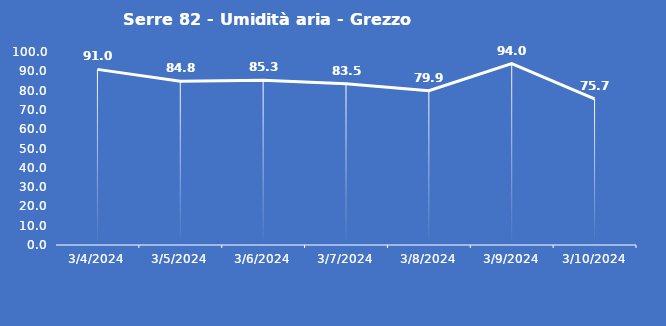
| Category | Serre 82 - Umidità aria - Grezzo (%) |
|---|---|
| 3/4/24 | 91 |
| 3/5/24 | 84.8 |
| 3/6/24 | 85.3 |
| 3/7/24 | 83.5 |
| 3/8/24 | 79.9 |
| 3/9/24 | 94 |
| 3/10/24 | 75.7 |